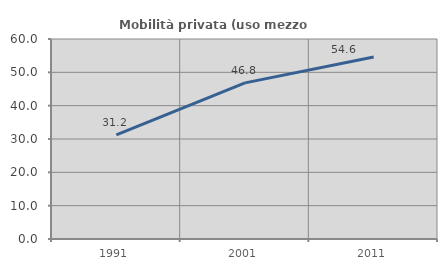
| Category | Mobilità privata (uso mezzo privato) |
|---|---|
| 1991.0 | 31.227 |
| 2001.0 | 46.832 |
| 2011.0 | 54.611 |